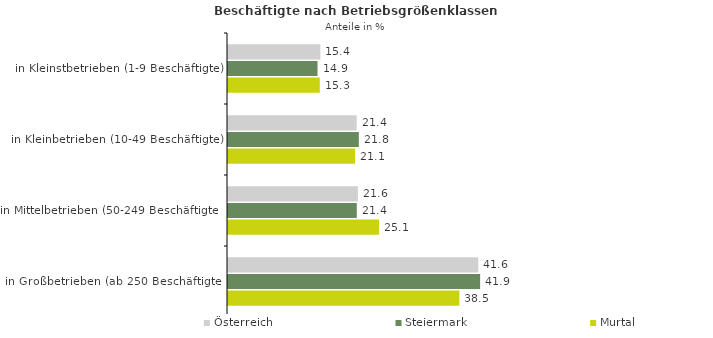
| Category | Österreich | Steiermark | Murtal |
|---|---|---|---|
| in Kleinstbetrieben (1-9 Beschäftigte) | 15.366 | 14.89 | 15.264 |
| in Kleinbetrieben (10-49 Beschäftigte) | 21.402 | 21.759 | 21.133 |
| in Mittelbetrieben (50-249 Beschäftigte) | 21.603 | 21.42 | 25.126 |
| in Großbetrieben (ab 250 Beschäftigte) | 41.629 | 41.932 | 38.478 |